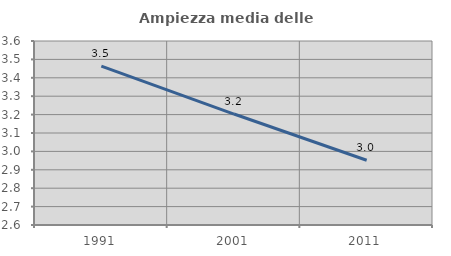
| Category | Ampiezza media delle famiglie |
|---|---|
| 1991.0 | 3.464 |
| 2001.0 | 3.203 |
| 2011.0 | 2.952 |